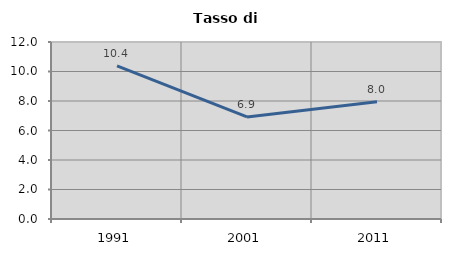
| Category | Tasso di disoccupazione   |
|---|---|
| 1991.0 | 10.386 |
| 2001.0 | 6.92 |
| 2011.0 | 7.956 |